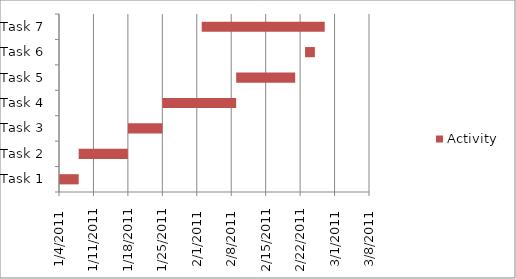
| Category | Start Date | Activity |
|---|---|---|
| Task 1 | 2011-01-03 | 5 |
| Task 2 | 2011-01-08 | 10 |
| Task 3 | 2011-01-18 | 7 |
| Task 4 | 2011-01-25 | 15 |
| Task 5 | 2011-02-09 | 12 |
| Task 6 | 2011-02-23 | 2 |
| Task 7 | 2011-02-02 | 25 |